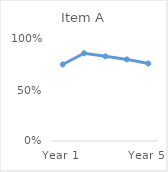
| Category | Item A |
|---|---|
| Year 1 | 0.75 |
| Year 2 | 0.86 |
| Year 3 | 0.83 |
| Year 4 | 0.8 |
| Year 5 | 0.76 |